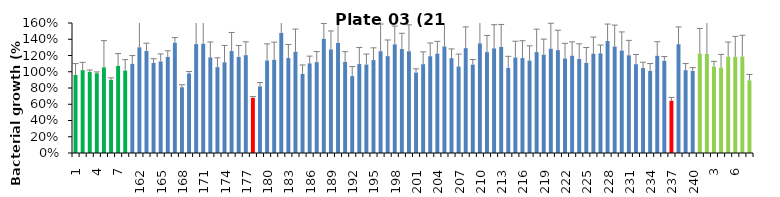
| Category | 21 h % |
|---|---|
| 1.0 | 0.96 |
| 2.0 | 1.019 |
| 3.0 | 0.998 |
| 4.0 | 0.982 |
| 5.0 | 1.054 |
| 6.0 | 0.9 |
| 7.0 | 1.072 |
| 8.0 | 1.014 |
| 161.0 | 1.097 |
| 162.0 | 1.3 |
| 163.0 | 1.255 |
| 164.0 | 1.108 |
| 165.0 | 1.127 |
| 166.0 | 1.182 |
| 167.0 | 1.357 |
| 168.0 | 0.809 |
| 169.0 | 0.979 |
| 170.0 | 1.34 |
| 171.0 | 1.344 |
| 172.0 | 1.177 |
| 173.0 | 1.056 |
| 174.0 | 1.117 |
| 175.0 | 1.254 |
| 176.0 | 1.182 |
| 177.0 | 1.205 |
| 178.0 | 0.678 |
| 179.0 | 0.82 |
| 180.0 | 1.139 |
| 181.0 | 1.146 |
| 182.0 | 1.477 |
| 183.0 | 1.169 |
| 184.0 | 1.246 |
| 185.0 | 0.973 |
| 186.0 | 1.103 |
| 187.0 | 1.118 |
| 188.0 | 1.405 |
| 189.0 | 1.276 |
| 190.0 | 1.354 |
| 191.0 | 1.121 |
| 192.0 | 0.946 |
| 193.0 | 1.095 |
| 194.0 | 1.088 |
| 195.0 | 1.143 |
| 196.0 | 1.252 |
| 197.0 | 1.192 |
| 198.0 | 1.337 |
| 199.0 | 1.28 |
| 200.0 | 1.252 |
| 201.0 | 0.99 |
| 202.0 | 1.093 |
| 203.0 | 1.191 |
| 204.0 | 1.223 |
| 205.0 | 1.31 |
| 206.0 | 1.167 |
| 207.0 | 1.064 |
| 208.0 | 1.29 |
| 209.0 | 1.088 |
| 210.0 | 1.349 |
| 211.0 | 1.242 |
| 212.0 | 1.288 |
| 213.0 | 1.305 |
| 214.0 | 1.047 |
| 215.0 | 1.175 |
| 216.0 | 1.169 |
| 217.0 | 1.137 |
| 218.0 | 1.242 |
| 219.0 | 1.21 |
| 220.0 | 1.283 |
| 221.0 | 1.266 |
| 222.0 | 1.163 |
| 223.0 | 1.197 |
| 224.0 | 1.157 |
| 225.0 | 1.109 |
| 226.0 | 1.222 |
| 227.0 | 1.226 |
| 228.0 | 1.378 |
| 229.0 | 1.31 |
| 230.0 | 1.261 |
| 231.0 | 1.202 |
| 232.0 | 1.093 |
| 233.0 | 1.045 |
| 234.0 | 1.009 |
| 235.0 | 1.197 |
| 236.0 | 1.134 |
| 237.0 | 0.644 |
| 238.0 | 1.339 |
| 239.0 | 1.019 |
| 240.0 | 1.01 |
| 1.0 | 1.224 |
| 2.0 | 1.218 |
| 3.0 | 1.064 |
| 4.0 | 1.051 |
| 5.0 | 1.184 |
| 6.0 | 1.185 |
| 7.0 | 1.186 |
| 8.0 | 0.894 |